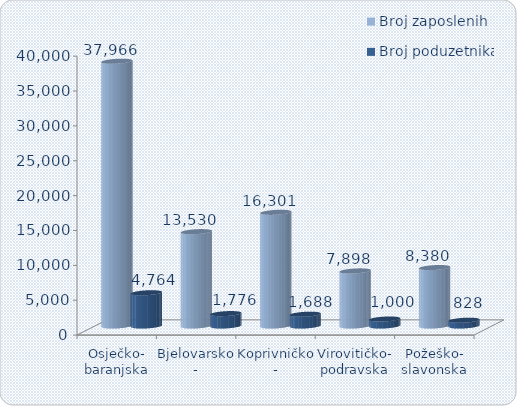
| Category | Broj zaposlenih | Broj poduzetnika |
|---|---|---|
| Osječko-
baranjska | 37966 | 4764 |
| Bjelovarsko-
bilogorska | 13530 | 1776 |
| Koprivničko-
križevačka | 16301 | 1688 |
| Virovitičko-
podravska | 7898 | 1000 |
| Požeško-
slavonska | 8380 | 828 |